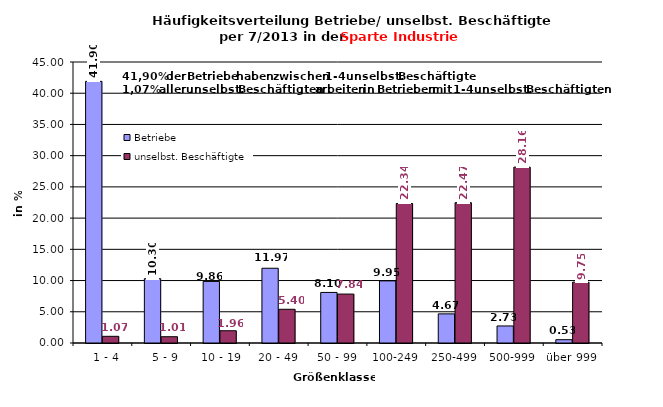
| Category | Betriebe | unselbst. Beschäftigte |
|---|---|---|
|   1 - 4 | 41.901 | 1.07 |
|   5 - 9 | 10.299 | 1.006 |
|  10 - 19 | 9.859 | 1.963 |
| 20 - 49 | 11.972 | 5.398 |
| 50 - 99 | 8.099 | 7.836 |
| 100-249 | 9.947 | 22.342 |
| 250-499 | 4.665 | 22.474 |
| 500-999 | 2.729 | 28.164 |
| über 999 | 0.528 | 9.747 |